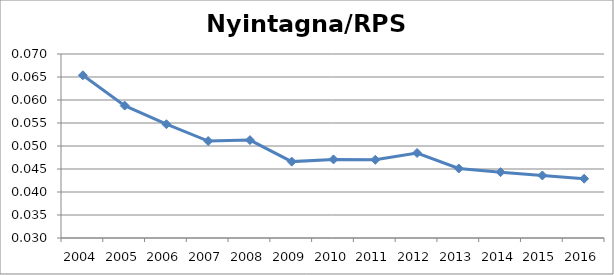
| Category | Nyintagna/RPS ut |
|---|---|
| 2004.0 | 0.065 |
| 2005.0 | 0.059 |
| 2006.0 | 0.055 |
| 2007.0 | 0.051 |
| 2008.0 | 0.051 |
| 2009.0 | 0.047 |
| 2010.0 | 0.047 |
| 2011.0 | 0.047 |
| 2012.0 | 0.048 |
| 2013.0 | 0.045 |
| 2014.0 | 0.044 |
| 2015.0 | 0.044 |
| 2016.0 | 0.043 |